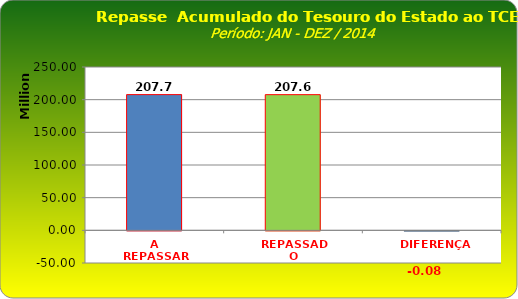
| Category | Series 0 |
|---|---|
| A REPASSAR | 207738232.51 |
| REPASSADO | 207656609.06 |
| DIFERENÇA | -81623.45 |